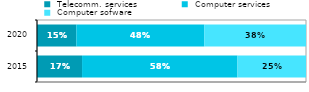
| Category |  Telecomm. services |  Computer services |  Computer sofware |
|---|---|---|---|
|  2015 | 0.167 | 0.578 | 0.255 |
|  2020 | 0.146 | 0.475 | 0.378 |